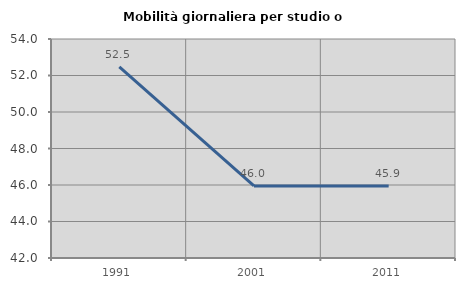
| Category | Mobilità giornaliera per studio o lavoro |
|---|---|
| 1991.0 | 52.476 |
| 2001.0 | 45.952 |
| 2011.0 | 45.944 |